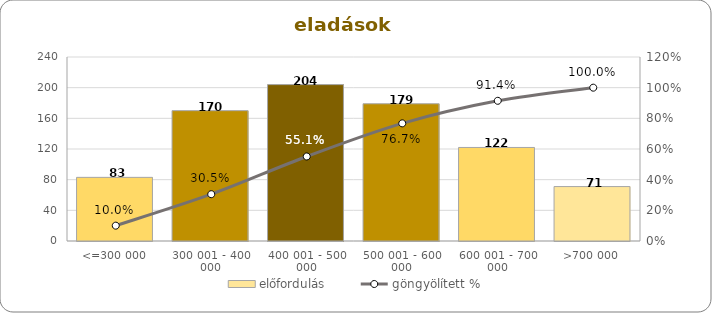
| Category | előfordulás |
|---|---|
| <=300 000 | 83 |
| 300 001 - 400 000 | 170 |
| 400 001 - 500 000 | 204 |
| 500 001 - 600 000 | 179 |
| 600 001 - 700 000 | 122 |
| >700 000 | 71 |